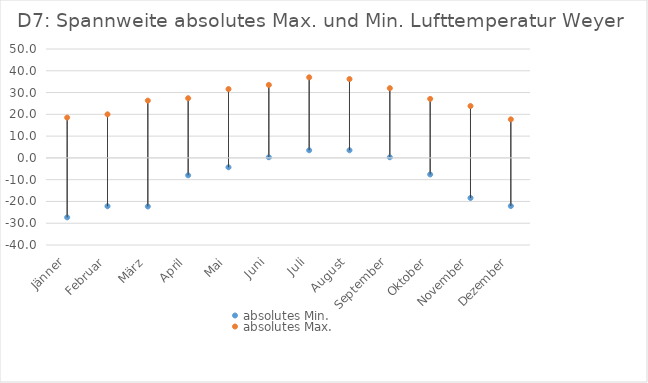
| Category | absolutes Min. | absolutes Max. |
|---|---|---|
| Jänner | -27.3 | 18.5 |
| Februar | -22.2 | 20 |
| März | -22.3 | 26.3 |
| April | -8 | 27.4 |
| Mai | -4.3 | 31.6 |
| Juni | 0.3 | 33.5 |
| Juli | 3.5 | 37 |
| August | 3.5 | 36.2 |
| September | 0.3 | 32 |
| Oktober | -7.6 | 27.1 |
| November | -18.4 | 23.8 |
| Dezember | -22.1 | 17.7 |